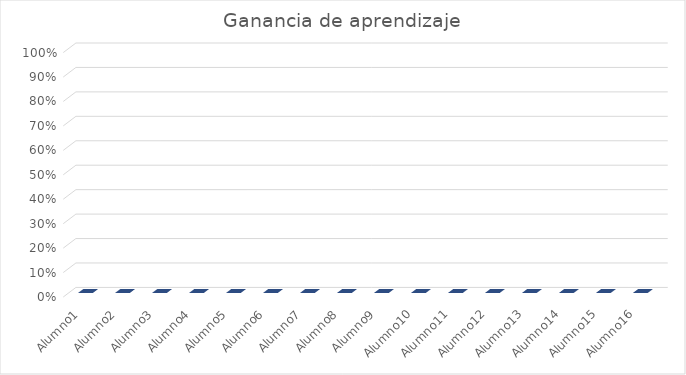
| Category | Series 0 |
|---|---|
| Alumno1 | 0 |
| Alumno2 | 0 |
| Alumno3 | 0 |
| Alumno4 | 0 |
| Alumno5 | 0 |
| Alumno6 | 0 |
| Alumno7 | 0 |
| Alumno8 | 0 |
| Alumno9 | 0 |
| Alumno10 | 0 |
| Alumno11 | 0 |
| Alumno12 | 0 |
| Alumno13 | 0 |
| Alumno14 | 0 |
| Alumno15 | 0 |
| Alumno16 | 0 |